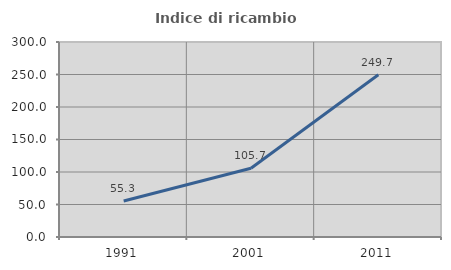
| Category | Indice di ricambio occupazionale  |
|---|---|
| 1991.0 | 55.336 |
| 2001.0 | 105.67 |
| 2011.0 | 249.693 |